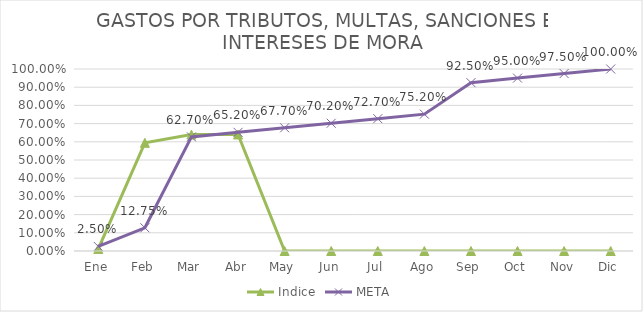
| Category | Indice | META |
|---|---|---|
| Ene | 0.011 | 0.025 |
| Feb | 0.594 | 0.128 |
| Mar | 0.64 | 0.627 |
| Abr | 0.64 | 0.652 |
| May | 0 | 0.677 |
| Jun | 0 | 0.702 |
| Jul | 0 | 0.727 |
| Ago | 0 | 0.752 |
| Sep | 0 | 0.925 |
| Oct | 0 | 0.95 |
| Nov | 0 | 0.975 |
| Dic | 0 | 1 |